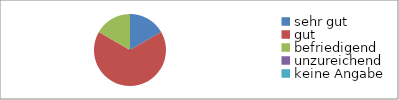
| Category | Series 0 |
|---|---|
| sehr gut | 4 |
| gut | 16 |
| befriedigend | 4 |
| unzureichend | 0 |
| keine Angabe | 0 |